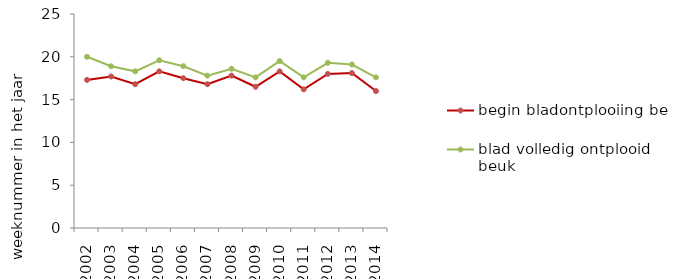
| Category | begin bladontplooiing beuk | blad volledig ontplooid beuk |
|---|---|---|
| 2002.0 | 17.3 | 20 |
| 2003.0 | 17.7 | 18.9 |
| 2004.0 | 16.8 | 18.3 |
| 2005.0 | 18.3 | 19.6 |
| 2006.0 | 17.5 | 18.9 |
| 2007.0 | 16.8 | 17.8 |
| 2008.0 | 17.8 | 18.6 |
| 2009.0 | 16.5 | 17.6 |
| 2010.0 | 18.3 | 19.5 |
| 2011.0 | 16.2 | 17.6 |
| 2012.0 | 18 | 19.3 |
| 2013.0 | 18.1 | 19.1 |
| 2014.0 | 16 | 17.6 |